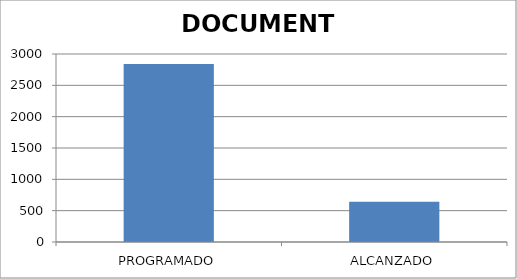
| Category | DOCUMENTO |
|---|---|
| PROGRAMADO | 2840 |
| ALCANZADO | 642 |